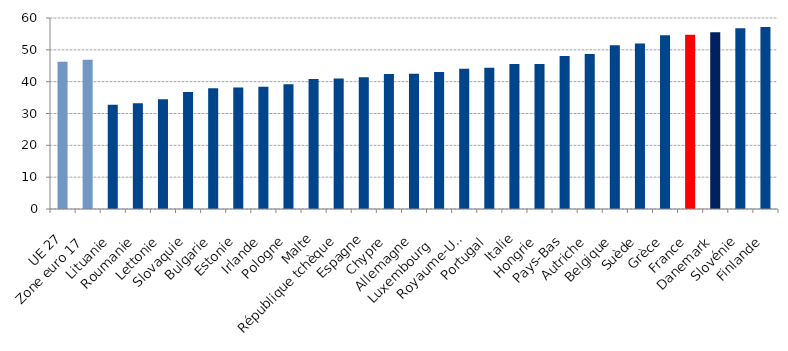
| Category | Series 0 |
|---|---|
| UE 27 | 46.288 |
| Zone euro 17 | 46.92 |
| Lituanie | 32.741 |
| Roumanie | 33.207 |
| Lettonie | 34.441 |
| Slovaquie | 36.747 |
| Bulgarie | 37.93 |
| Estonie | 38.186 |
| Irlande | 38.381 |
| Pologne | 39.214 |
| Malte | 40.859 |
| République tchèque | 40.961 |
| Espagne | 41.421 |
| Chypre | 42.371 |
| Allemagne | 42.52 |
| Luxembourg  | 43.047 |
| Royaume-Uni | 44.088 |
| Portugal  | 44.347 |
| Italie | 45.523 |
| Hongrie | 45.543 |
| Pays-Bas | 48.056 |
| Autriche | 48.691 |
| Belgique | 51.428 |
| Suède | 52.023 |
| Grèce | 54.573 |
| France  | 54.777 |
| Danemark | 55.486 |
| Slovénie | 56.807 |
| Finlande | 57.163 |